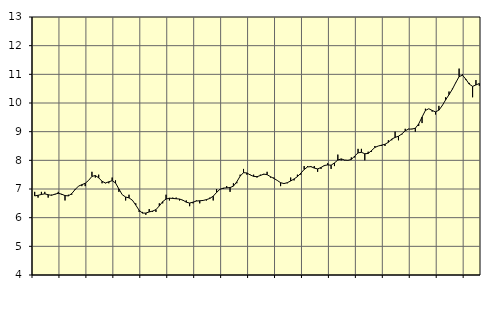
| Category | Piggar | Offentlig förvaltning m.m., SNI 84, 99 |
|---|---|---|
| nan | 6.9 | 6.76 |
| 87.0 | 6.7 | 6.78 |
| 87.0 | 6.9 | 6.81 |
| 87.0 | 6.9 | 6.83 |
| nan | 6.7 | 6.8 |
| 88.0 | 6.8 | 6.78 |
| 88.0 | 6.8 | 6.82 |
| 88.0 | 6.9 | 6.85 |
| nan | 6.8 | 6.82 |
| 89.0 | 6.6 | 6.77 |
| 89.0 | 6.8 | 6.76 |
| 89.0 | 6.8 | 6.84 |
| nan | 7 | 6.98 |
| 90.0 | 7.1 | 7.1 |
| 90.0 | 7.1 | 7.15 |
| 90.0 | 7.1 | 7.2 |
| nan | 7.3 | 7.3 |
| 91.0 | 7.6 | 7.44 |
| 91.0 | 7.4 | 7.47 |
| 91.0 | 7.5 | 7.39 |
| nan | 7.2 | 7.27 |
| 92.0 | 7.2 | 7.21 |
| 92.0 | 7.2 | 7.25 |
| 92.0 | 7.4 | 7.29 |
| nan | 7.3 | 7.21 |
| 93.0 | 6.9 | 7 |
| 93.0 | 6.8 | 6.8 |
| 93.0 | 6.6 | 6.72 |
| nan | 6.8 | 6.69 |
| 94.0 | 6.6 | 6.61 |
| 94.0 | 6.5 | 6.44 |
| 94.0 | 6.2 | 6.26 |
| nan | 6.2 | 6.16 |
| 95.0 | 6.1 | 6.16 |
| 95.0 | 6.3 | 6.2 |
| 95.0 | 6.2 | 6.23 |
| nan | 6.2 | 6.28 |
| 96.0 | 6.5 | 6.41 |
| 96.0 | 6.5 | 6.56 |
| 96.0 | 6.8 | 6.65 |
| nan | 6.6 | 6.68 |
| 97.0 | 6.7 | 6.67 |
| 97.0 | 6.7 | 6.66 |
| 97.0 | 6.6 | 6.65 |
| nan | 6.6 | 6.61 |
| 98.0 | 6.6 | 6.54 |
| 98.0 | 6.4 | 6.51 |
| 98.0 | 6.5 | 6.54 |
| nan | 6.6 | 6.58 |
| 99.0 | 6.5 | 6.59 |
| 99.0 | 6.6 | 6.6 |
| 99.0 | 6.6 | 6.63 |
| nan | 6.7 | 6.67 |
| 0.0 | 6.6 | 6.75 |
| 0.0 | 7 | 6.88 |
| 0.0 | 7 | 6.99 |
| nan | 7 | 7.03 |
| 1.0 | 7.1 | 7.04 |
| 1.0 | 6.9 | 7.05 |
| 1.0 | 7.2 | 7.1 |
| nan | 7.2 | 7.25 |
| 2.0 | 7.5 | 7.45 |
| 2.0 | 7.7 | 7.57 |
| 2.0 | 7.5 | 7.56 |
| nan | 7.5 | 7.49 |
| 3.0 | 7.5 | 7.44 |
| 3.0 | 7.4 | 7.43 |
| 3.0 | 7.5 | 7.47 |
| nan | 7.5 | 7.52 |
| 4.0 | 7.6 | 7.5 |
| 4.0 | 7.4 | 7.43 |
| 4.0 | 7.4 | 7.37 |
| nan | 7.3 | 7.3 |
| 5.0 | 7.1 | 7.22 |
| 5.0 | 7.2 | 7.19 |
| 5.0 | 7.2 | 7.22 |
| nan | 7.4 | 7.28 |
| 6.0 | 7.3 | 7.35 |
| 6.0 | 7.5 | 7.43 |
| 6.0 | 7.5 | 7.55 |
| nan | 7.8 | 7.68 |
| 7.0 | 7.8 | 7.77 |
| 7.0 | 7.8 | 7.78 |
| 7.0 | 7.8 | 7.73 |
| nan | 7.6 | 7.7 |
| 8.0 | 7.7 | 7.75 |
| 8.0 | 7.8 | 7.82 |
| 8.0 | 7.9 | 7.84 |
| nan | 7.7 | 7.83 |
| 9.0 | 7.8 | 7.91 |
| 9.0 | 8.2 | 8.01 |
| 9.0 | 8 | 8.05 |
| nan | 8 | 8.01 |
| 10.0 | 8 | 8 |
| 10.0 | 8.1 | 8.03 |
| 10.0 | 8.1 | 8.15 |
| nan | 8.4 | 8.26 |
| 11.0 | 8.4 | 8.28 |
| 11.0 | 8 | 8.23 |
| 11.0 | 8.3 | 8.24 |
| nan | 8.3 | 8.34 |
| 12.0 | 8.5 | 8.45 |
| 12.0 | 8.5 | 8.5 |
| 12.0 | 8.5 | 8.53 |
| nan | 8.5 | 8.56 |
| 13.0 | 8.7 | 8.63 |
| 13.0 | 8.7 | 8.74 |
| 13.0 | 9 | 8.8 |
| nan | 8.7 | 8.84 |
| 14.0 | 8.9 | 8.92 |
| 14.0 | 9.1 | 9.03 |
| 14.0 | 9.1 | 9.09 |
| nan | 9.1 | 9.09 |
| 15.0 | 9 | 9.12 |
| 15.0 | 9.2 | 9.27 |
| 15.0 | 9.3 | 9.51 |
| nan | 9.8 | 9.74 |
| 16.0 | 9.8 | 9.8 |
| 16.0 | 9.7 | 9.74 |
| 16.0 | 9.6 | 9.69 |
| nan | 9.9 | 9.75 |
| 17.0 | 9.9 | 9.91 |
| 17.0 | 10.2 | 10.11 |
| 17.0 | 10.4 | 10.29 |
| nan | 10.5 | 10.48 |
| 18.0 | 10.7 | 10.71 |
| 18.0 | 11.2 | 10.92 |
| 18.0 | 11 | 10.97 |
| nan | 10.8 | 10.83 |
| 19.0 | 10.7 | 10.66 |
| 19.0 | 10.2 | 10.58 |
| 19.0 | 10.8 | 10.63 |
| nan | 10.6 | 10.68 |